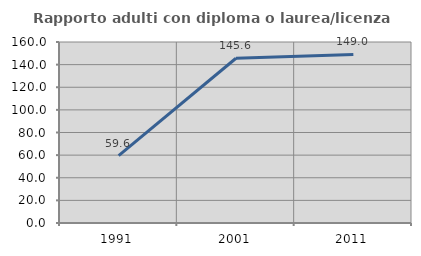
| Category | Rapporto adulti con diploma o laurea/licenza media  |
|---|---|
| 1991.0 | 59.574 |
| 2001.0 | 145.631 |
| 2011.0 | 148.958 |